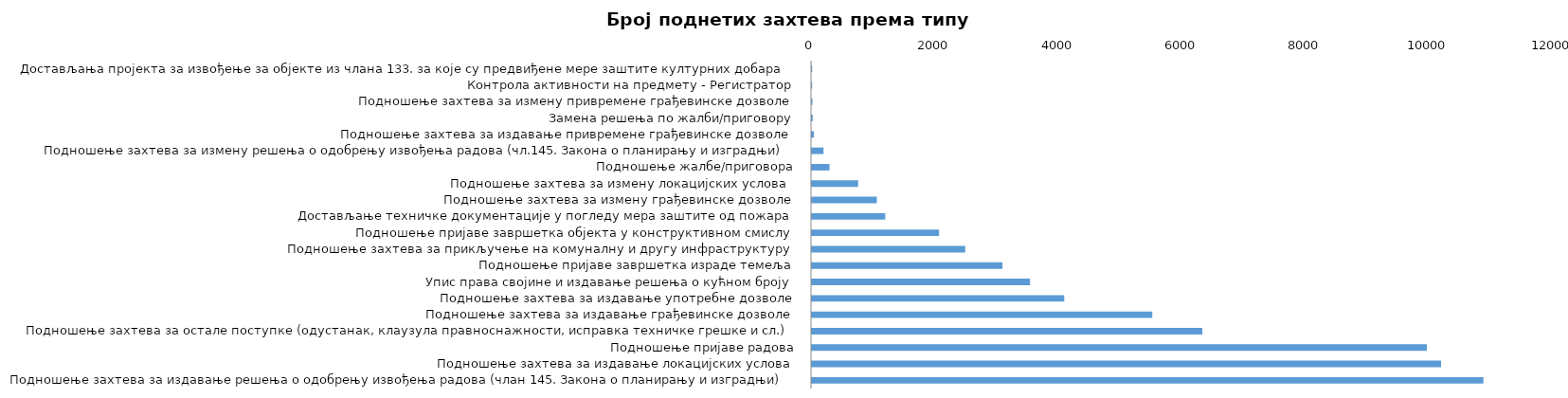
| Category | Series 0 |
|---|---|
| Достављања пројекта за извођење за објекте из члана 133. за које су предвиђене мере заштите културних добара | 3 |
| Контрола активности на предмету - Регистратор | 3 |
| Подношење захтева за измену привремене грађевинске дозволе | 7 |
| Замена решења по жалби/приговору | 13 |
| Подношење захтева за издавање привремене грађевинске дозволе | 32 |
| Подношење захтева за измену решења о одобрењу извођења радова (чл.145. Закона о планирању и изградњи) | 187 |
| Подношење жалбе/приговора | 284 |
| Подношење захтева за измену локацијских услова  | 747 |
| Подношење захтева за измену грађевинске дозволе | 1049 |
| Достављање техничке документације у погледу мера заштите од пожара | 1186 |
| Подношење пријаве завршетка објекта у конструктивном смислу | 2056 |
| Подношење захтева за прикључење на комуналну и другу инфраструктуру | 2479 |
| Подношење пријаве завршетка израде темеља | 3082 |
| Упис права својине и издавање решења о кућном броју | 3527 |
| Подношење захтева за издавање употребне дозволе | 4081 |
| Подношење захтева за издавање грађевинске дозволе | 5505 |
| Подношење захтева за остале поступке (одустанак, клаузула правноснажности, исправка техничке грешке и сл.) | 6315 |
| Подношење пријаве радова | 9947 |
| Подношење захтева за издавање локацијских услова | 10177 |
| Подношење захтева за издавање решења о одобрењу извођења радова (члан 145. Закона о планирању и изградњи) | 10861 |